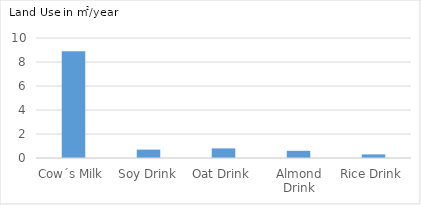
| Category | Land Use in m2/year |
|---|---|
| Cow´s Milk | 8.9 |
| Soy Drink | 0.7 |
| Oat Drink | 0.8 |
| Almond Drink | 0.6 |
| Rice Drink | 0.3 |